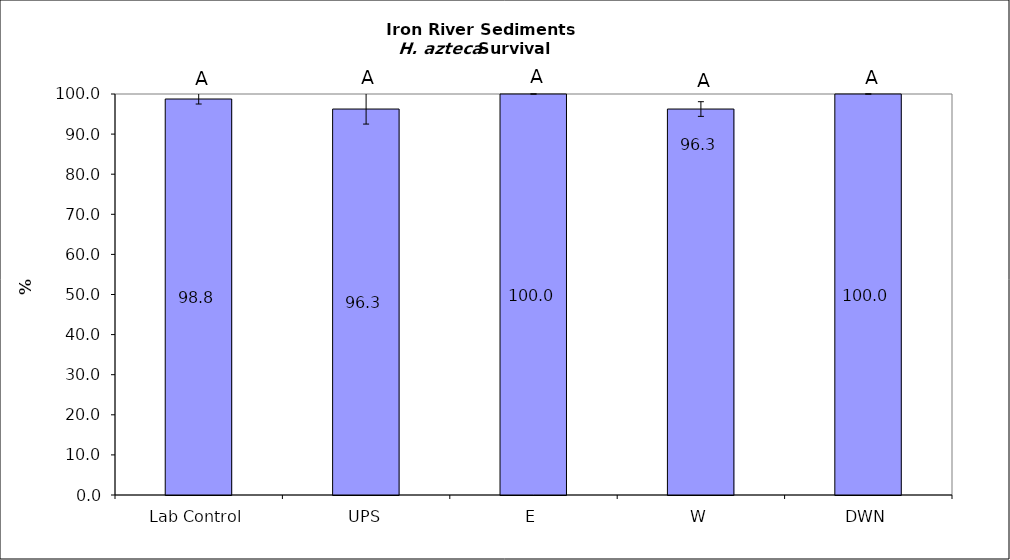
| Category | 1.3 3.8 0.0 1.8 0.0 |
|---|---|
| Lab Control | 98.75 |
| UPS | 96.25 |
| E | 100 |
| W | 96.25 |
| DWN | 100 |